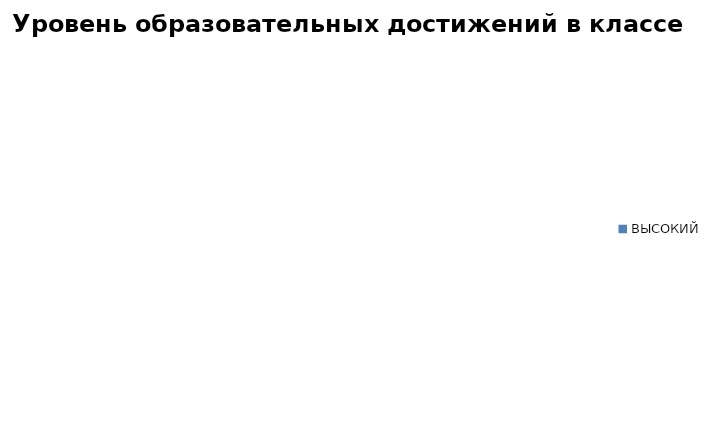
| Category | Series 0 |
|---|---|
| ВЫСОКИЙ | 0 |